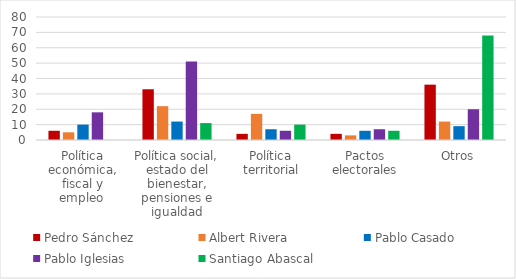
| Category | Pedro Sánchez | Albert Rivera | Pablo Casado | Pablo Iglesias | Santiago Abascal |
|---|---|---|---|---|---|
| Política económica, fiscal y empleo  | 6 | 5 | 10 | 18 | 0 |
| Política social, estado del bienestar, pensiones e igualdad | 33 | 22 | 12 | 51 | 11 |
| Política territorial | 4 | 17 | 7 | 6 | 10 |
| Pactos electorales | 4 | 3 | 6 | 7 | 6 |
| Otros | 36 | 12 | 9 | 20 | 68 |